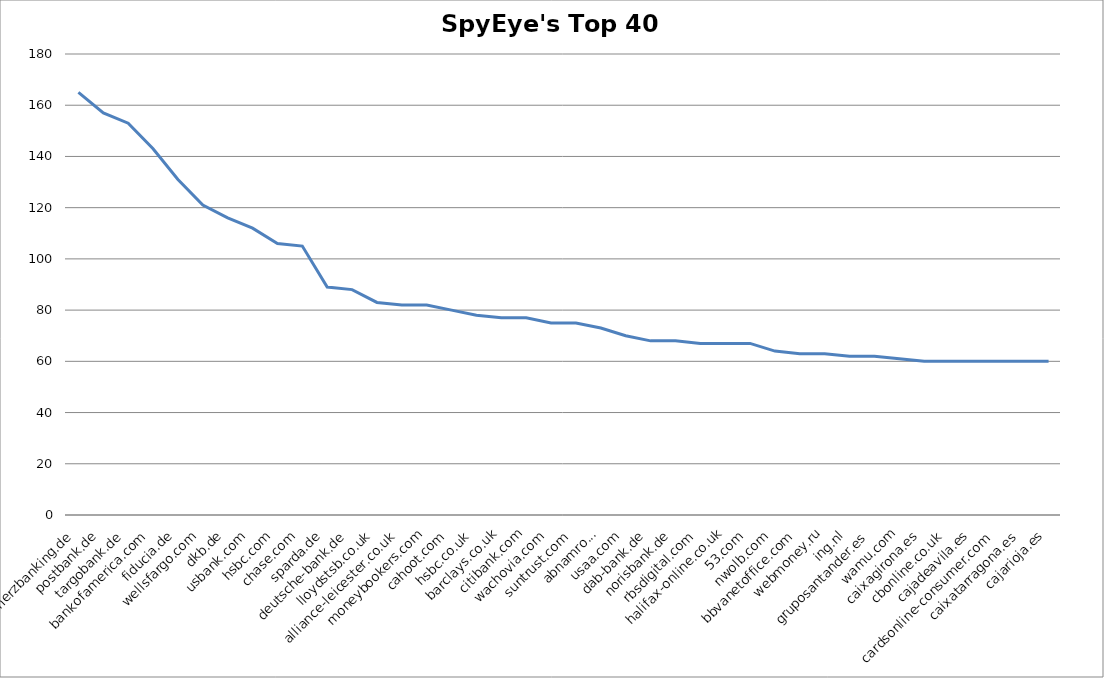
| Category | Banks |
|---|---|
| commerzbanking.de | 165 |
| postbank.de | 157 |
| targobank.de | 153 |
| bankofamerica.com | 143 |
| fiducia.de | 131 |
| wellsfargo.com | 121 |
| dkb.de | 116 |
| usbank.com | 112 |
| hsbc.com | 106 |
| chase.com | 105 |
| sparda.de | 89 |
| deutsche-bank.de | 88 |
| lloydstsb.co.uk | 83 |
| alliance-leicester.co.uk | 82 |
| moneybookers.com | 82 |
| cahoot.com | 80 |
| hsbc.co.uk | 78 |
| barclays.co.uk | 77 |
| citibank.com | 77 |
| wachovia.com | 75 |
| suntrust.com | 75 |
| abnamro.nl | 73 |
| usaa.com | 70 |
| dab-bank.de | 68 |
| norisbank.de | 68 |
| rbsdigital.com | 67 |
| halifax-online.co.uk | 67 |
| 53.com | 67 |
| nwolb.com | 64 |
| bbvanetoffice.com | 63 |
| webmoney.ru | 63 |
| ing.nl | 62 |
| gruposantander.es | 62 |
| wamu.com | 61 |
| caixagirona.es | 60 |
| cbonline.co.uk | 60 |
| cajadeavila.es | 60 |
| cardsonline-consumer.com | 60 |
| caixatarragona.es | 60 |
| cajarioja.es | 60 |